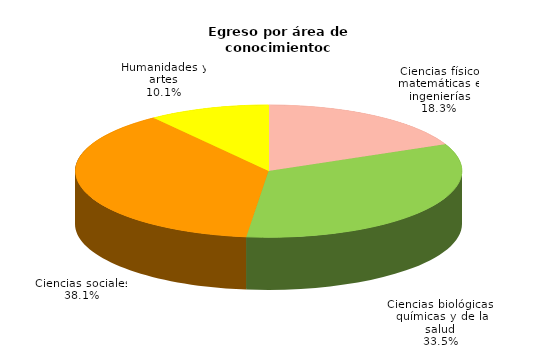
| Category | Series 0 |
|---|---|
| Ciencias físico matemáticas e ingenierías | 5870 |
| Ciencias biológicas, químicas y de la salud | 10732 |
| Ciencias sociales | 12192 |
| Humanidades y artes | 3238 |